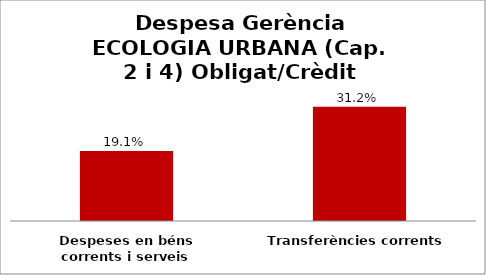
| Category | Series 0 |
|---|---|
| Despeses en béns corrents i serveis | 0.191 |
| Transferències corrents | 0.312 |